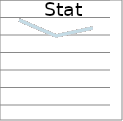
| Category | *msharron 0% | etalley 67% | aesrick 69% | eerickson 74% | ndoubleday 75% | tkreek 75% | bgreen 78% | tfurcolo 80% | cviele 80% | jsamale 80% | rvigderman 80% | skillip 80% | tdumont 82% | rpotee 83% | cnormandin1 83% | jpolgar 83% | sesrick 83% | yperry 84% | dslack 84% | hsimkin 85% | fkim 86% | lappleton 86% | lschwartz 86% | mgump 87% | jfeinland 88% | pkeough 89% | rkatz 89% | cweeber 89% | pbuchanan 90% | mmohr 91% | pcarlan 91% | ecory 92% | pthaler 92% | piverson 92% | dkaufman 92% | klopezdelcastillo 93% | rmidler 95% | jppalmer 98% | canderson 100% | ecloke 100% |
|---|---|---|---|---|---|---|---|---|---|---|---|---|---|---|---|---|---|---|---|---|---|---|---|---|---|---|---|---|---|---|---|---|---|---|---|---|---|---|---|---|
| 0 | 0.97 | 0.97 | 0.97 | 0.97 | 0.97 | 0.97 | 0.97 | 0.97 | 0.97 | 0.97 | 0.97 | 0.97 | 0.97 | 0.97 | 0.97 | 0.97 | 0.97 | 0.97 | 0.97 | 0.97 | 0.97 | 0.97 | 0.97 | 0.97 | 0.97 | 0.97 | 0.97 | 0.97 | 0.97 | 0.97 | 0.97 | 0.97 | 0.97 | 0.97 | 0.97 | 0.97 | 0.97 | 0.97 | 0.97 | 0.97 |
| 1 | 0.79 | 0.79 | 0.79 | 0.79 | 0.79 | 0.79 | 0.79 | 0.79 | 0.79 | 0.79 | 0.79 | 0.79 | 0.79 | 0.79 | 0.79 | 0.79 | 0.79 | 0.79 | 0.79 | 0.79 | 0.79 | 0.79 | 0.79 | 0.79 | 0.79 | 0.79 | 0.79 | 0.79 | 0.79 | 0.79 | 0.79 | 0.79 | 0.79 | 0.79 | 0.79 | 0.79 | 0.79 | 0.79 | 0.79 | 0.79 |
| 2 | 0.88 | 0.88 | 0.88 | 0.88 | 0.88 | 0.88 | 0.88 | 0.88 | 0.88 | 0.88 | 0.88 | 0.88 | 0.88 | 0.88 | 0.88 | 0.88 | 0.88 | 0.88 | 0.88 | 0.88 | 0.88 | 0.88 | 0.88 | 0.88 | 0.88 | 0.88 | 0.88 | 0.88 | 0.88 | 0.88 | 0.88 | 0.88 | 0.88 | 0.88 | 0.88 | 0.88 | 0.88 | 0.88 | 0.88 | 0.88 |